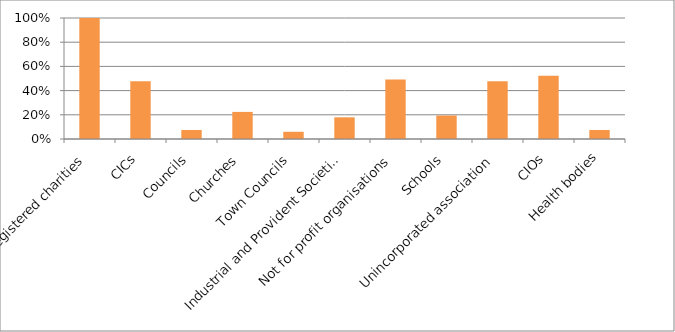
| Category | Series 0 |
|---|---|
| Registered charities | 1.03 |
| CICs | 0.478 |
| Councils | 0.075 |
| Churches | 0.224 |
| Town Councils | 0.06 |
|  Industrial and Provident Societies | 0.179 |
| Not for profit organisations | 0.493 |
| Schools | 0.194 |
| Unincorporated association | 0.478 |
| CIOs | 0.522 |
| Health bodies | 0.075 |